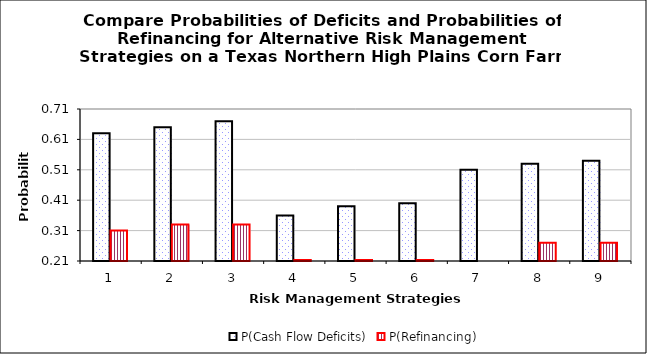
| Category | P(Cash Flow Deficits) | P(Refinancing) |
|---|---|---|
| 0 | 0.63 | 0.31 |
| 1 | 0.65 | 0.33 |
| 2 | 0.67 | 0.33 |
| 3 | 0.36 | 0.14 |
| 4 | 0.39 | 0.14 |
| 5 | 0.4 | 0.14 |
| 6 | 0.51 | 0.21 |
| 7 | 0.53 | 0.27 |
| 8 | 0.54 | 0.27 |